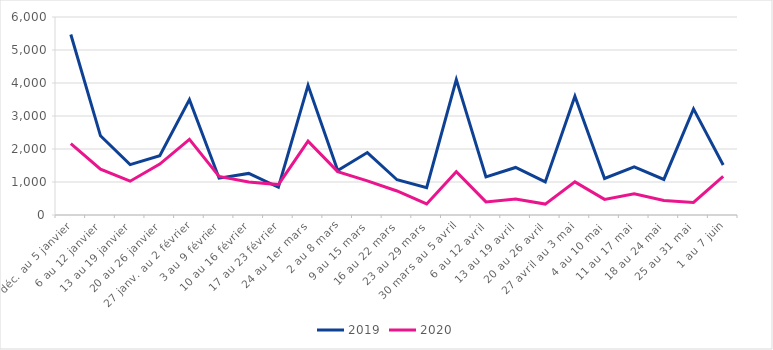
| Category | 2019 | 2020 |
|---|---|---|
| 30 déc. au 5 janvier | 5470 | 2162 |
| 6 au 12 janvier | 2400 | 1391 |
| 13 au 19 janvier | 1527 | 1024 |
| 20 au 26 janvier | 1798 | 1544 |
| 27 janv. au 2 février | 3495 | 2291 |
| 3 au 9 février | 1116 | 1168 |
| 10 au 16 février | 1260 | 1001 |
| 17 au 23 février | 841 | 922 |
| 24 au 1er mars | 3928 | 2236 |
| 2 au 8 mars | 1349 | 1315 |
| 9 au 15 mars | 1893 | 1034 |
| 16 au 22 mars | 1068 | 728 |
| 23 au 29 mars | 828 | 336 |
| 30 mars au 5 avril | 4105 | 1310 |
| 6 au 12 avril | 1156 | 397 |
| 13 au 19 avril | 1440 | 484 |
| 20 au 26 avril | 1002 | 331 |
| 27 avril au 3 mai | 3595 | 1004 |
| 4 au 10 mai | 1106 | 474 |
| 11 au 17 mai | 1456 | 645 |
| 18 au 24 mai | 1078 | 437 |
| 25 au 31 mai | 3215 | 382 |
| 1 au 7 juin | 1515 | 1170 |